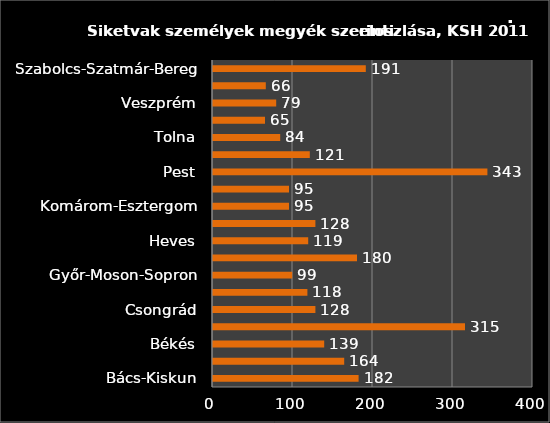
| Category | Series 0 |
|---|---|
|  Bács-Kiskun | 182 |
|  Baranya | 164 |
|  Békés | 139 |
|   Borsod-Abaúj-Zemplén | 315 |
|  Csongrád | 128 |
|  Fejér | 118 |
|  Győr-Moson-Sopron | 99 |
| Hajdú-Bihar | 180 |
| Heves | 119 |
| Jász-Nagykun-Szolnok | 128 |
| Komárom-Esztergom | 95 |
| Nógrád | 95 |
|  Pest | 343 |
|  Somogy | 121 |
|  Tolna | 84 |
| Vas | 65 |
|  Veszprém | 79 |
|   Zala | 66 |
|  Szabolcs-Szatmár-Bereg | 191 |